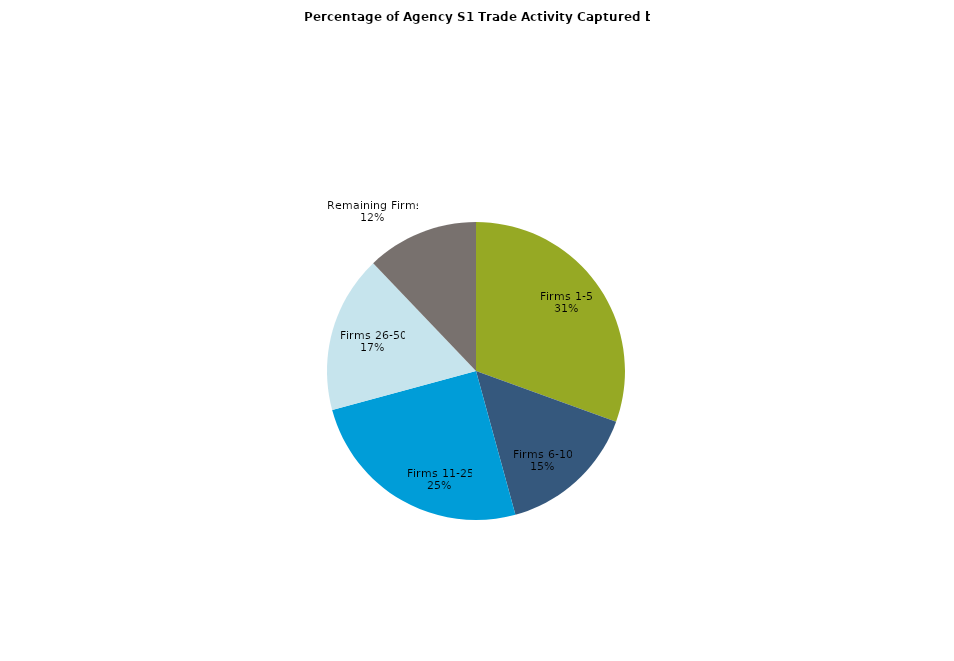
| Category | Series 0 |
|---|---|
| Firms 1-5 | 0.305 |
| Firms 6-10 | 0.152 |
| Firms 11-25 | 0.25 |
| Firms 26-50 | 0.171 |
| Remaining Firms | 0.121 |